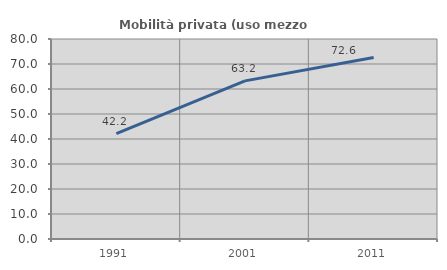
| Category | Mobilità privata (uso mezzo privato) |
|---|---|
| 1991.0 | 42.173 |
| 2001.0 | 63.25 |
| 2011.0 | 72.566 |